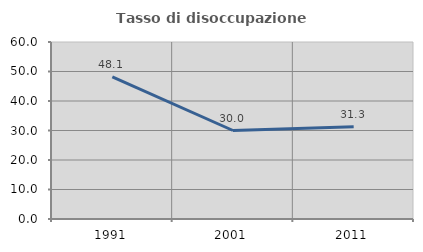
| Category | Tasso di disoccupazione giovanile  |
|---|---|
| 1991.0 | 48.148 |
| 2001.0 | 30 |
| 2011.0 | 31.25 |